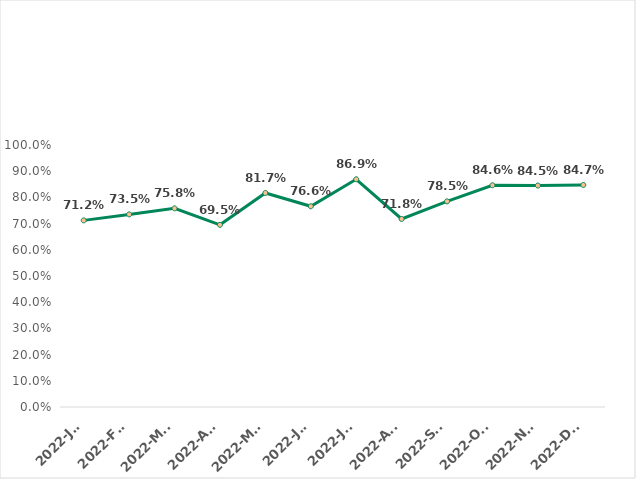
| Category | Machine Utilization |
|---|---|
| 2022-Jan | 0.712 |
| 2022-Feb | 0.735 |
| 2022-Mar | 0.758 |
| 2022-Apr | 0.695 |
| 2022-May | 0.817 |
| 2022-Jun | 0.766 |
| 2022-Jul | 0.869 |
| 2022-Aug | 0.718 |
| 2022-Sep | 0.785 |
| 2022-Oct | 0.846 |
| 2022-Nov | 0.845 |
| 2022-Dec | 0.847 |